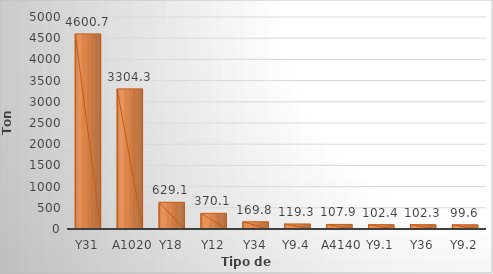
| Category | Series 0 |
|---|---|
| Y31 | 4600.674 |
| A1020 | 3304.341 |
| Y18 | 629.083 |
| Y12 | 370.107 |
| Y34 | 169.773 |
| Y9.4 | 119.348 |
| A4140 | 107.934 |
| Y9.1 | 102.43 |
| Y36 | 102.255 |
| Y9.2 | 99.633 |